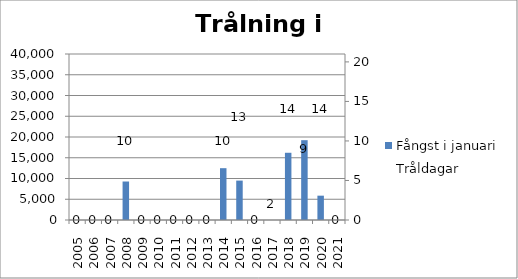
| Category | Fångst i januari |
|---|---|
| 2005.0 | 0 |
| 2006.0 | 0 |
| 2007.0 | 0 |
| 2008.0 | 9275 |
| 2009.0 | 0 |
| 2010.0 | 0 |
| 2011.0 | 0 |
| 2012.0 | 0 |
| 2013.0 | 0 |
| 2014.0 | 12485 |
| 2015.0 | 9494 |
| 2016.0 | 0 |
| 2017.0 | 2 |
| 2018.0 | 16199 |
| 2019.0 | 19234 |
| 2020.0 | 5862 |
| 2021.0 | 0 |